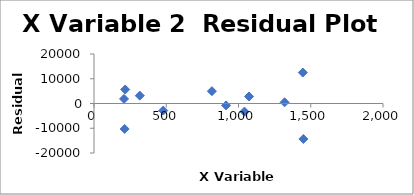
| Category | Series 0 |
|---|---|
| 317.0 | 3179.001 |
| 208.0 | 1862.122 |
| 816.0 | 4978.237 |
| 216.0 | 5661.135 |
| 479.0 | -2855.446 |
| 1445.0 | 12503.956 |
| 212.0 | -10273.226 |
| 1319.0 | 474.834 |
| 1041.0 | -3281.13 |
| 914.0 | -755.657 |
| 1449.0 | -14334.44 |
| 1073.0 | 2840.615 |